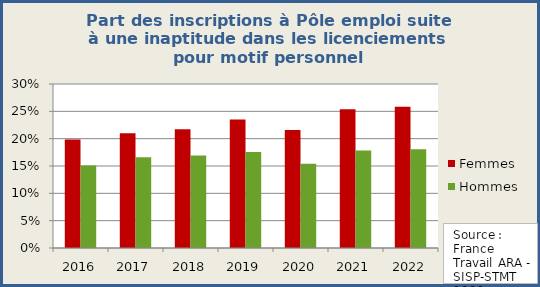
| Category | Femmes | Hommes |
|---|---|---|
| 2016.0 | 0.199 | 0.151 |
| 2017.0 | 0.21 | 0.166 |
| 2018.0 | 0.217 | 0.169 |
| 2019.0 | 0.235 | 0.176 |
| 2020.0 | 0.216 | 0.154 |
| 2021.0 | 0.254 | 0.178 |
| 2022.0 | 0.259 | 0.181 |